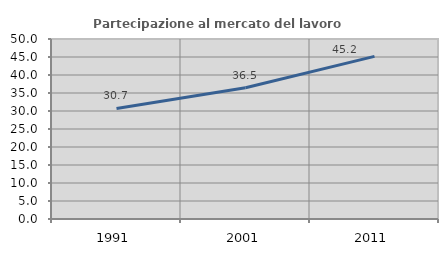
| Category | Partecipazione al mercato del lavoro  femminile |
|---|---|
| 1991.0 | 30.723 |
| 2001.0 | 36.456 |
| 2011.0 | 45.167 |